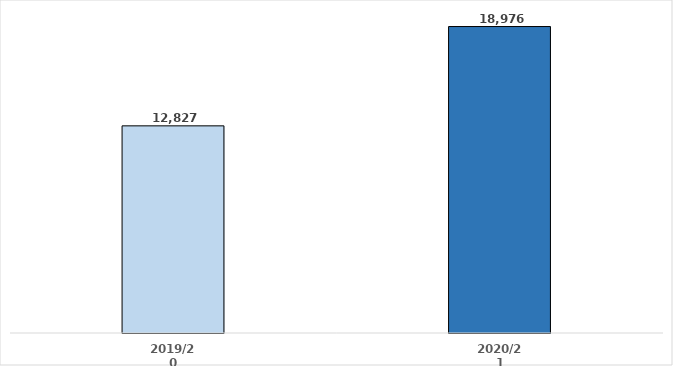
| Category | Series 0 |
|---|---|
| 2019/20 | 12827 |
| 2020/21 | 18976 |